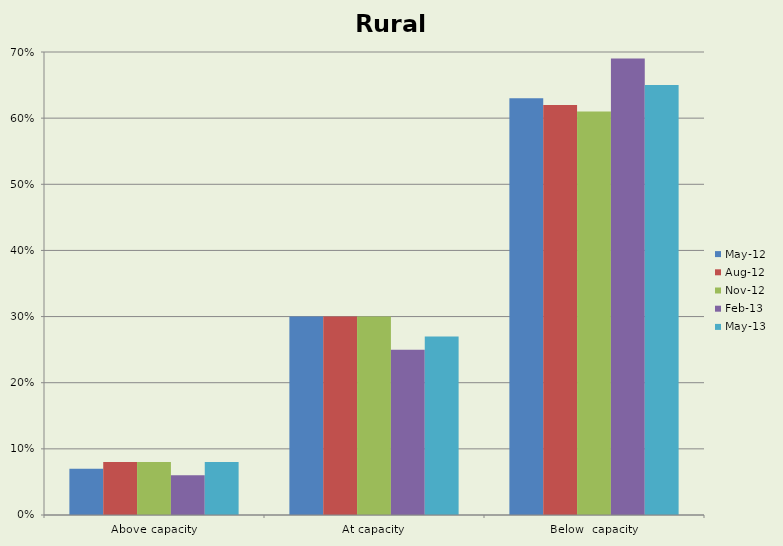
| Category | May-12 | Aug-12 | Nov-12 | Feb-13 | May-13 |
|---|---|---|---|---|---|
| Above capacity | 0.07 | 0.08 | 0.08 | 0.06 | 0.08 |
| At capacity | 0.3 | 0.3 | 0.3 | 0.25 | 0.27 |
| Below  capacity | 0.63 | 0.62 | 0.61 | 0.69 | 0.65 |